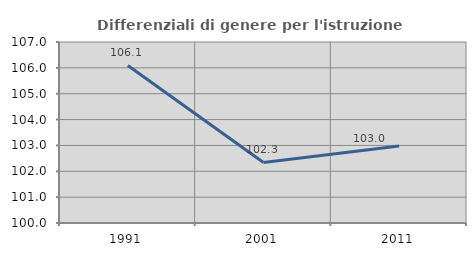
| Category | Differenziali di genere per l'istruzione superiore |
|---|---|
| 1991.0 | 106.092 |
| 2001.0 | 102.34 |
| 2011.0 | 102.978 |